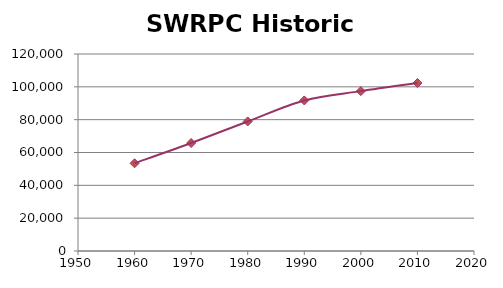
| Category | Series 0 |
|---|---|
| 1960.0 | 53424 |
| 1970.0 | 65771 |
| 1980.0 | 78910 |
| 1990.0 | 91721 |
| 2000.0 | 97391 |
| 2010.0 | 102313 |